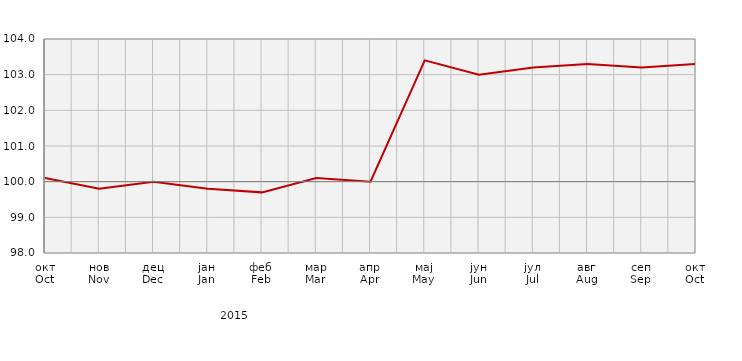
| Category | Индекси цијена произвођача
Producer price indices |
|---|---|
| окт
Oct | 100.1 |
| нов
Nov | 99.8 |
| дец
Dec | 100 |
| јан
Jan | 99.8 |
| феб
Feb | 99.7 |
| мар
Mar | 100.1 |
| апр
Apr | 100 |
| мај
May | 103.4 |
| јун
Jun | 103 |
| јул
Jul | 103.2 |
| авг
Aug | 103.3 |
| сеп
Sep | 103.2 |
| окт
Oct | 103.3 |